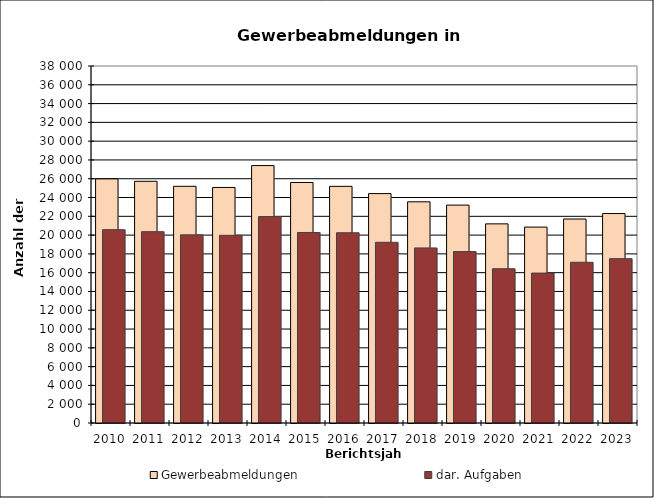
| Category | Gewerbeabmeldungen | dar. Aufgaben |
|---|---|---|
| 2010.0 | 25984 | 20578 |
| 2011.0 | 25729 | 20364 |
| 2012.0 | 25195 | 20027 |
| 2013.0 | 25071 | 19975 |
| 2014.0 | 27402 | 21971 |
| 2015.0 | 25601 | 20280 |
| 2016.0 | 25189 | 20252 |
| 2017.0 | 24417 | 19234 |
| 2018.0 | 23545 | 18633 |
| 2019.0 | 23193 | 18245 |
| 2020.0 | 21196 | 16419 |
| 2021.0 | 20853 | 15957 |
| 2022.0 | 21711 | 17109 |
| 2023.0 | 22295 | 17494 |